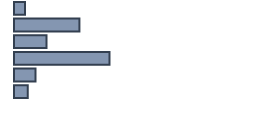
| Category | Percentatge |
|---|---|
| 0 | 4.633 |
| 1 | 27.256 |
| 2 | 13.581 |
| 3 | 39.788 |
| 4 | 8.965 |
| 5 | 5.778 |